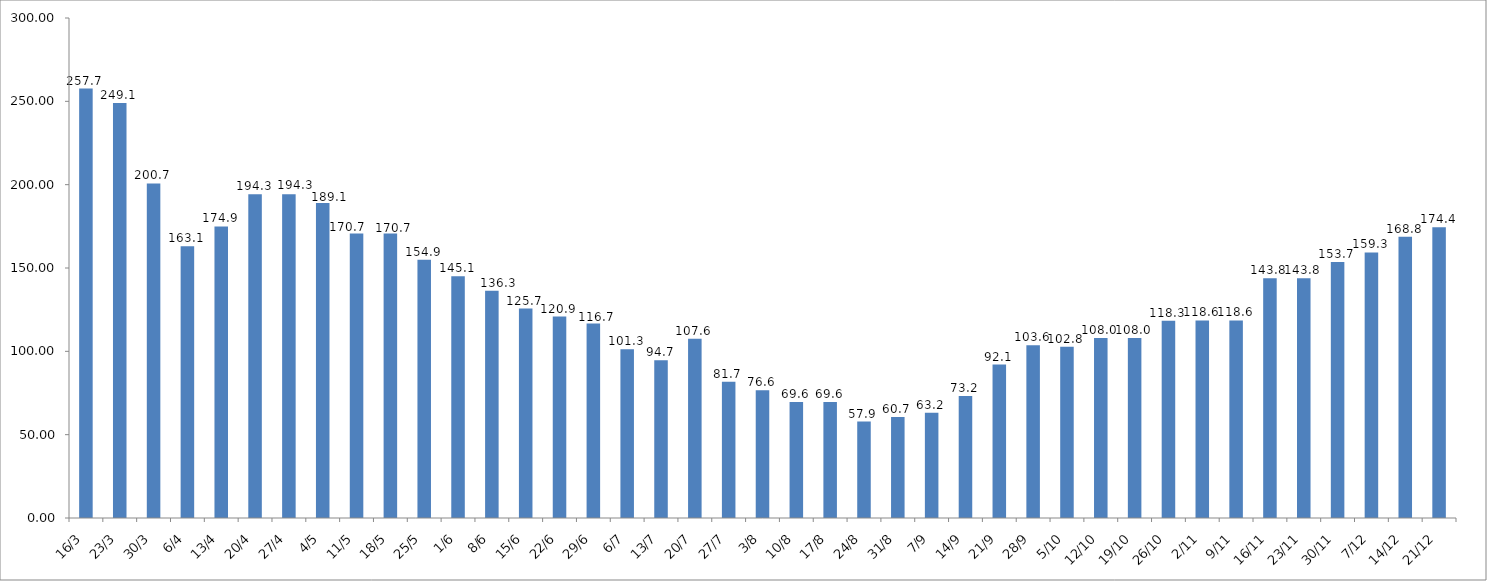
| Category | Series 0 |
|---|---|
| 2020-03-16 | 257.667 |
| 2020-03-23 | 249.067 |
| 2020-03-30 | 200.733 |
| 2020-04-06 | 163.083 |
| 2020-04-13 | 174.917 |
| 2020-04-20 | 194.317 |
| 2020-04-27 | 194.317 |
| 2020-05-04 | 189.067 |
| 2020-05-11 | 170.65 |
| 2020-05-18 | 170.65 |
| 2020-05-25 | 154.908 |
| 2020-06-01 | 145.067 |
| 2020-06-08 | 136.317 |
| 2020-06-15 | 125.65 |
| 2020-06-22 | 120.9 |
| 2020-06-29 | 116.733 |
| 2020-07-06 | 101.25 |
| 2020-07-13 | 94.667 |
| 2020-07-20 | 107.558 |
| 2020-07-27 | 81.7 |
| 2020-08-03 | 76.617 |
| 2020-08-10 | 69.617 |
| 2020-08-17 | 69.617 |
| 2020-08-24 | 57.867 |
| 2020-08-31 | 60.667 |
| 2020-09-07 | 63.167 |
| 2020-09-14 | 73.233 |
| 2020-09-21 | 92.067 |
| 2020-09-28 | 103.58 |
| 2020-10-05 | 102.817 |
| 2020-10-12 | 107.983 |
| 2020-10-19 | 107.983 |
| 2020-10-26 | 118.317 |
| 2020-11-02 | 118.567 |
| 2020-11-09 | 118.567 |
| 2020-11-16 | 143.817 |
| 2020-11-23 | 143.817 |
| 2020-11-30 | 153.65 |
| 2020-12-07 | 159.317 |
| 2020-12-14 | 168.817 |
| 2020-12-21 | 174.39 |